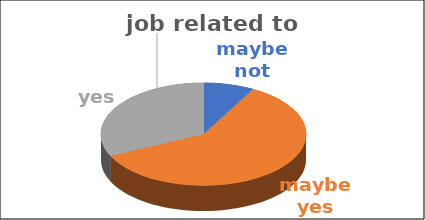
| Category | job related to studies | Series 1 | Series 2 | Series 3 | Series 4 |
|---|---|---|---|---|---|
| maybe not | 0.08 |  |  |  |  |
| maybe yes | 0.6 |  |  |  |  |
| yes | 0.32 |  |  |  |  |